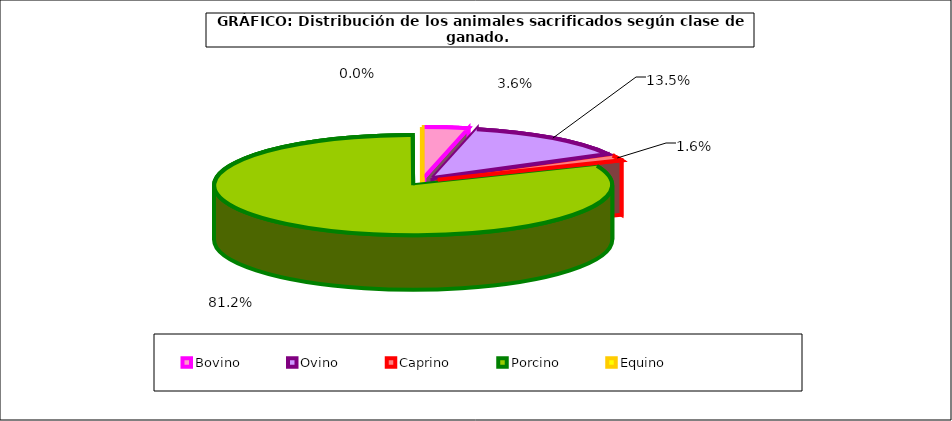
| Category | Series 0 |
|---|---|
| 0 | 2552368 |
| 1 | 9711254 |
| 2 | 1175573 |
| 3 | 58370485 |
| 4 | 33073 |